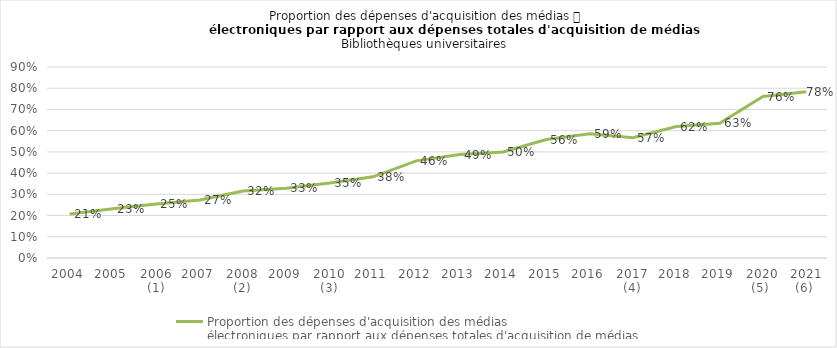
| Category | Proportion des dépenses d'acquisition des médias 
électroniques par rapport aux dépenses totales d'acquisition de médias |
|---|---|
| 2004 | 0.208 |
| 2005 | 0.232 |
| 2006 (1) | 0.255 |
| 2007 | 0.273 |
| 2008 (2) | 0.316 |
| 2009 | 0.329 |
| 2010 (3) | 0.353 |
| 2011 | 0.382 |
| 2012 | 0.458 |
| 2013 | 0.488 |
| 2014 | 0.499 |
| 2015 | 0.558 |
| 2016 | 0.586 |
| 2017 (4) | 0.567 |
| 2018 | 0.619 |
| 2019 | 0.635 |
| 2020 (5)  | 0.761 |
| 2021 (6)  | 0.783 |